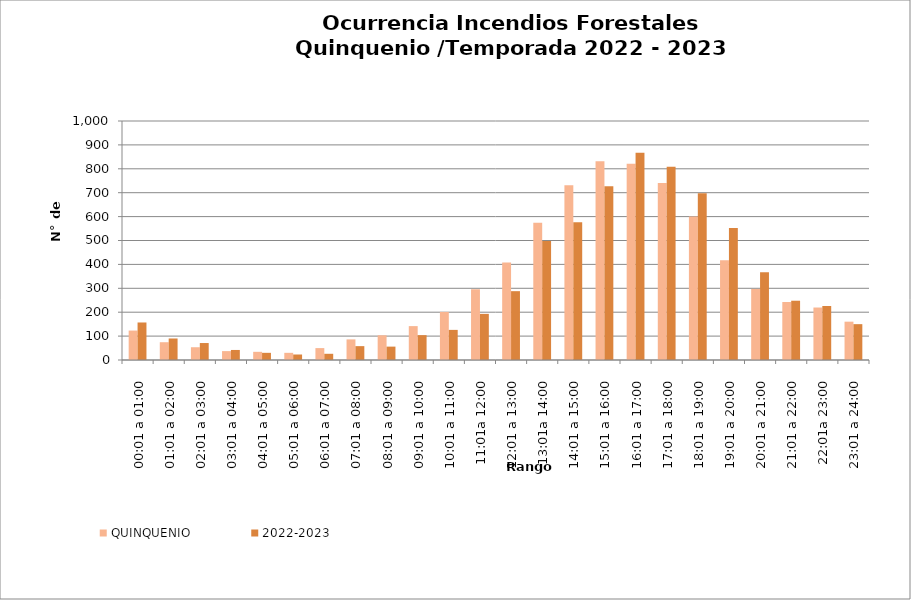
| Category | QUINQUENIO | 2022-2023 |
|---|---|---|
| 00:01 a 01:00 | 123.2 | 157 |
| 01:01 a 02:00 | 74.4 | 90 |
| 02:01 a 03:00 | 53.4 | 71 |
| 03:01 a 04:00 | 37.2 | 42 |
| 04:01 a 05:00 | 34.2 | 30 |
| 05:01 a 06:00 | 30 | 23 |
| 06:01 a 07:00 | 49.8 | 26 |
| 07:01 a 08:00 | 86.2 | 58 |
| 08:01 a 09:00 | 103.4 | 56 |
| 09:01 a 10:00 | 141.8 | 104 |
| 10:01 a 11:00 | 201 | 126 |
| 11:01a 12:00 | 296 | 193 |
| 12:01 a 13:00 | 407.6 | 288 |
| 13:01a 14:00 | 574.2 | 498 |
| 14:01 a 15:00 | 731.2 | 576 |
| 15:01 a 16:00 | 831.6 | 727 |
| 16:01 a 17:00 | 821.6 | 867 |
| 17:01 a 18:00 | 740.8 | 809 |
| 18:01 a 19:00 | 600.2 | 698 |
| 19:01 a 20:00 | 417.4 | 552 |
| 20:01 a 21:00 | 297.4 | 367 |
| 21:01 a 22:00 | 242.6 | 248 |
| 22:01a 23:00 | 219.6 | 226 |
| 23:01 a 24:00 | 160.4 | 150 |